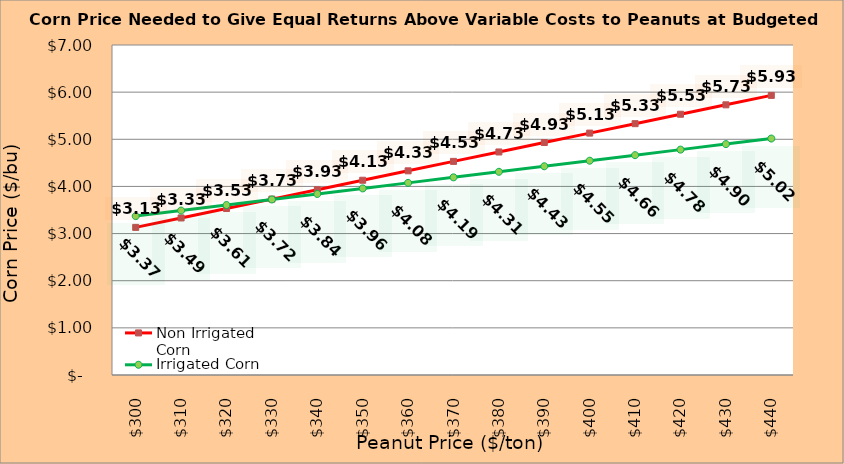
| Category | Non Irrigated Corn | Irrigated Corn |
|---|---|---|
| 299.8936170212766 | 3.131 | 3.371 |
| 309.8936170212766 | 3.331 | 3.488 |
| 319.8936170212766 | 3.531 | 3.606 |
| 329.8936170212766 | 3.731 | 3.723 |
| 339.8936170212766 | 3.931 | 3.841 |
| 349.8936170212766 | 4.131 | 3.958 |
| 359.8936170212766 | 4.331 | 4.076 |
| 369.8936170212766 | 4.531 | 4.193 |
| 379.8936170212766 | 4.731 | 4.311 |
| 389.8936170212766 | 4.931 | 4.428 |
| 399.8936170212766 | 5.131 | 4.546 |
| 409.8936170212766 | 5.331 | 4.663 |
| 419.8936170212766 | 5.531 | 4.781 |
| 429.8936170212766 | 5.731 | 4.898 |
| 439.8936170212766 | 5.931 | 5.016 |